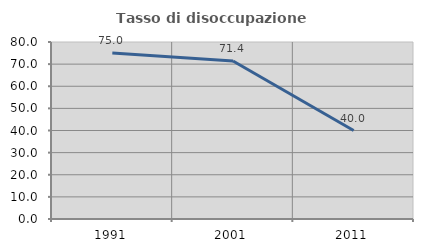
| Category | Tasso di disoccupazione giovanile  |
|---|---|
| 1991.0 | 75 |
| 2001.0 | 71.429 |
| 2011.0 | 40 |